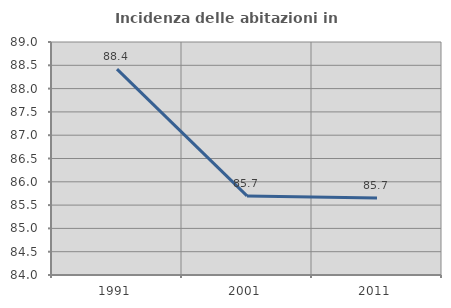
| Category | Incidenza delle abitazioni in proprietà  |
|---|---|
| 1991.0 | 88.418 |
| 2001.0 | 85.697 |
| 2011.0 | 85.651 |